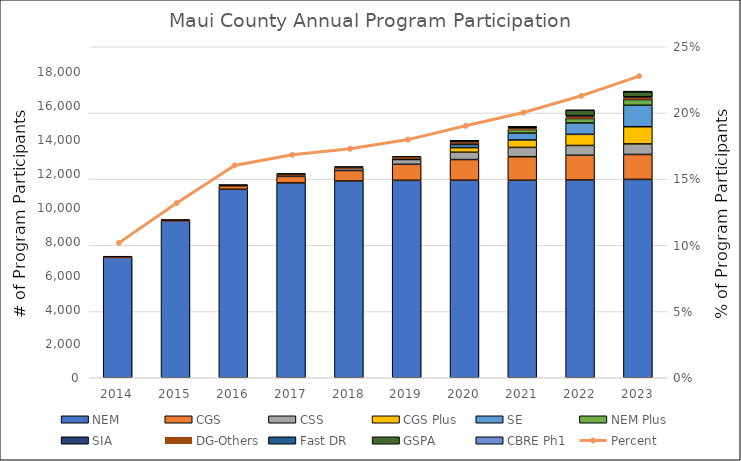
| Category | NEM | CGS | CSS | CGS Plus | SE | NEM Plus | SIA | DG-Others | Fast DR | GSPA | CBRE Ph1 |
|---|---|---|---|---|---|---|---|---|---|---|---|
| 2014.0 | 7098 | 0 | 0 | 0 | 0 | 0 | 17 | 17 | 4 | 0 | 0 |
| 2015.0 | 9256 | 0 | 0 | 0 | 0 | 0 | 20 | 20 | 4 | 0 | 0 |
| 2016.0 | 11103 | 195 | 2 | 0 | 0 | 0 | 27 | 27 | 4 | 0 | 0 |
| 2017.0 | 11478 | 384 | 77 | 0 | 0 | 0 | 34 | 34 | 3 | 0 | 0 |
| 2018.0 | 11591 | 618 | 131 | 0 | 0 | 0 | 38 | 38 | 12 | 0 | 0 |
| 2019.0 | 11631 | 943 | 283 | 47 | 2 | 17 | 46 | 46 | 29 | 0 | 0 |
| 2020.0 | 11637 | 1218 | 430 | 274 | 179 | 89 | 47 | 47 | 29 | 2 | 1 |
| 2021.0 | 11635 | 1390 | 545 | 438 | 401 | 212 | 46 | 46 | 29 | 38 | 1 |
| 2022.0 | 11651 | 1456 | 578 | 656 | 667 | 263 | 66 | 66 | 43 | 312 | 1 |
| 2023.0 | 11685 | 1470 | 621 | 1013 | 1264 | 336 | 72 | 72 | 22 | 300 | 1 |